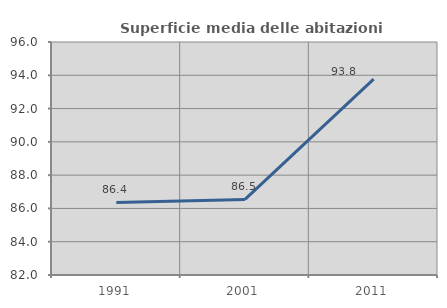
| Category | Superficie media delle abitazioni occupate |
|---|---|
| 1991.0 | 86.363 |
| 2001.0 | 86.544 |
| 2011.0 | 93.773 |